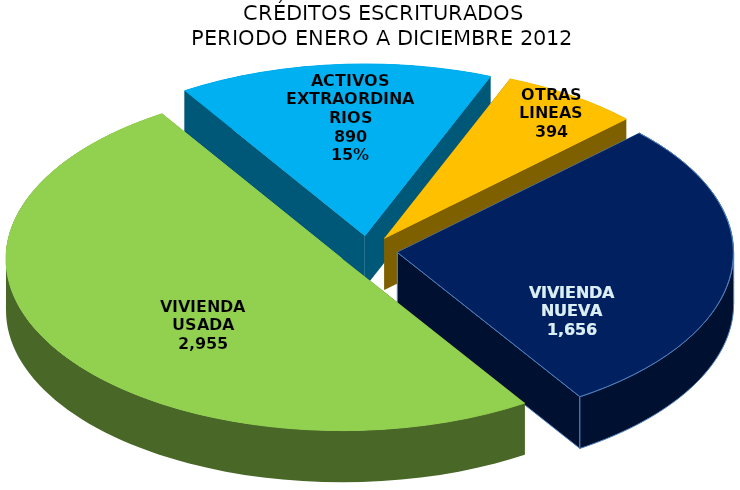
| Category | Series 0 |
|---|---|
| VIVIENDA NUEVA | 1656 |
| VIVIENDA USADA | 2955 |
| ACTIVOS EXTRAORDINARIOS | 890 |
| OTRAS LINEAS | 394 |